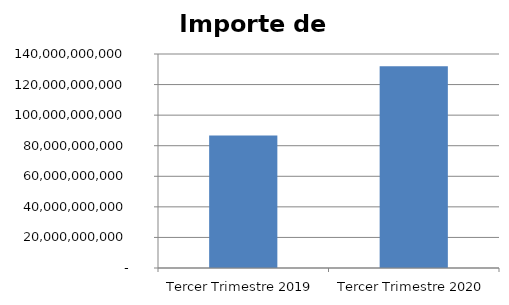
| Category | Importe de Préstamos  |
|---|---|
| Tercer Trimestre 2019 | 86653577351 |
| Tercer Trimestre 2020 | 132051803353 |